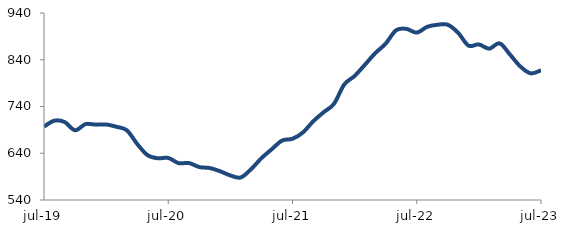
| Category | Series 0 |
|---|---|
| 2019-07-01 | 697.076 |
| 2019-08-01 | 709.635 |
| 2019-09-01 | 706.734 |
| 2019-10-01 | 689.137 |
| 2019-11-01 | 702.277 |
| 2019-12-01 | 701.214 |
| 2020-01-01 | 701.517 |
| 2020-02-01 | 696.552 |
| 2020-03-01 | 689.099 |
| 2020-04-01 | 659.896 |
| 2020-05-01 | 635.894 |
| 2020-06-01 | 629.29 |
| 2020-07-01 | 629.994 |
| 2020-08-01 | 618.866 |
| 2020-09-01 | 619.022 |
| 2020-10-01 | 610.428 |
| 2020-11-01 | 608.402 |
| 2020-12-01 | 601.605 |
| 2021-01-01 | 592.504 |
| 2021-02-01 | 588.185 |
| 2021-03-01 | 605.989 |
| 2021-04-01 | 629.446 |
| 2021-05-01 | 648.73 |
| 2021-06-01 | 667.177 |
| 2021-07-01 | 670.996 |
| 2021-08-01 | 684.389 |
| 2021-09-01 | 708.308 |
| 2021-10-01 | 727.608 |
| 2021-11-01 | 745.65 |
| 2021-12-01 | 787.184 |
| 2022-01-01 | 805.308 |
| 2022-02-01 | 829.502 |
| 2022-03-01 | 854.336 |
| 2022-04-01 | 874.453 |
| 2022-05-01 | 903.049 |
| 2022-06-01 | 906.022 |
| 2022-07-01 | 898.071 |
| 2022-08-01 | 910.353 |
| 2022-09-01 | 914.859 |
| 2022-10-01 | 914.857 |
| 2022-11-01 | 897.607 |
| 2022-12-01 | 870.196 |
| 2023-01-01 | 872.784 |
| 2023-02-01 | 863.736 |
| 2023-03-01 | 875.118 |
| 2023-04-01 | 851.276 |
| 2023-05-01 | 825.667 |
| 2023-06-01 | 810.924 |
| 2023-07-01 | 817.469 |